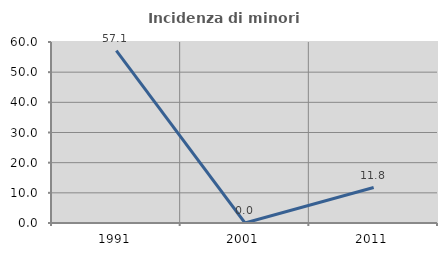
| Category | Incidenza di minori stranieri |
|---|---|
| 1991.0 | 57.143 |
| 2001.0 | 0 |
| 2011.0 | 11.765 |